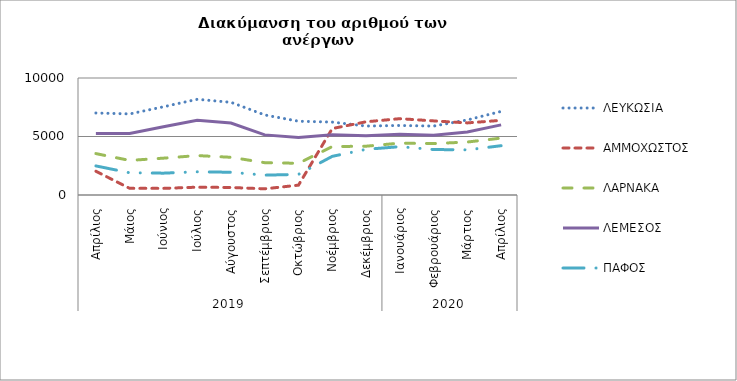
| Category | ΛΕΥΚΩΣΙΑ | ΑΜΜΟΧΩΣΤΟΣ | ΛΑΡΝΑΚΑ | ΛΕΜΕΣΟΣ | ΠΑΦΟΣ |
|---|---|---|---|---|---|
| 0 | 7010 | 2030 | 3539 | 5250 | 2486 |
| 1 | 6929 | 570 | 2955 | 5254 | 1899 |
| 2 | 7540 | 567 | 3149 | 5837 | 1867 |
| 3 | 8179 | 668 | 3369 | 6382 | 1984 |
| 4 | 7922 | 641 | 3223 | 6153 | 1944 |
| 5 | 6840 | 529 | 2762 | 5139 | 1697 |
| 6 | 6306 | 843 | 2710 | 4922 | 1763 |
| 7 | 6231 | 5679 | 4139 | 5142 | 3304 |
| 8 | 5893 | 6256 | 4171 | 5061 | 3904 |
| 9 | 5943 | 6524 | 4433 | 5185 | 4129 |
| 10 | 5890 | 6335 | 4394 | 5114 | 3887 |
| 11 | 6416 | 6162 | 4527 | 5390 | 3858 |
| 12 | 7143 | 6380 | 4862 | 5992 | 4214 |